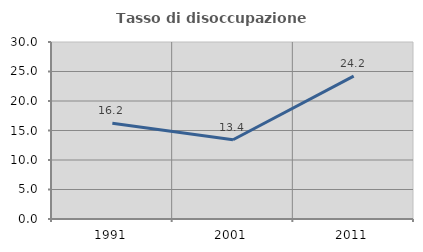
| Category | Tasso di disoccupazione giovanile  |
|---|---|
| 1991.0 | 16.228 |
| 2001.0 | 13.433 |
| 2011.0 | 24.227 |